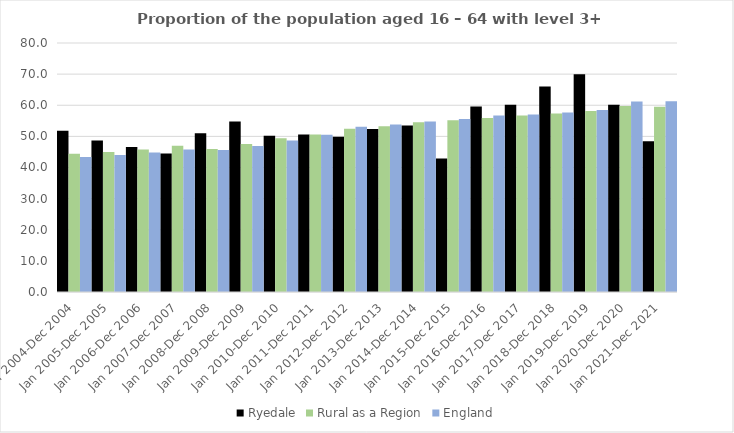
| Category | Ryedale | Rural as a Region | England |
|---|---|---|---|
| Jan 2004-Dec 2004 | 51.8 | 44.405 | 43.4 |
| Jan 2005-Dec 2005 | 48.7 | 44.973 | 44 |
| Jan 2006-Dec 2006 | 46.6 | 45.774 | 44.8 |
| Jan 2007-Dec 2007 | 44.5 | 46.968 | 45.8 |
| Jan 2008-Dec 2008 | 51 | 45.964 | 45.6 |
| Jan 2009-Dec 2009 | 54.8 | 47.59 | 46.9 |
| Jan 2010-Dec 2010 | 50.2 | 49.362 | 48.7 |
| Jan 2011-Dec 2011 | 50.6 | 50.602 | 50.5 |
| Jan 2012-Dec 2012 | 49.9 | 52.439 | 53.1 |
| Jan 2013-Dec 2013 | 52.4 | 53.276 | 53.8 |
| Jan 2014-Dec 2014 | 53.5 | 54.57 | 54.8 |
| Jan 2015-Dec 2015 | 42.9 | 55.16 | 55.6 |
| Jan 2016-Dec 2016 | 59.6 | 55.941 | 56.7 |
| Jan 2017-Dec 2017 | 60.2 | 56.689 | 57 |
| Jan 2018-Dec 2018 | 66 | 57.389 | 57.7 |
| Jan 2019-Dec 2019 | 70 | 58.147 | 58.5 |
| Jan 2020-Dec 2020 | 60.2 | 59.771 | 61.2 |
| Jan 2021-Dec 2021 | 48.4 | 59.54 | 61.3 |